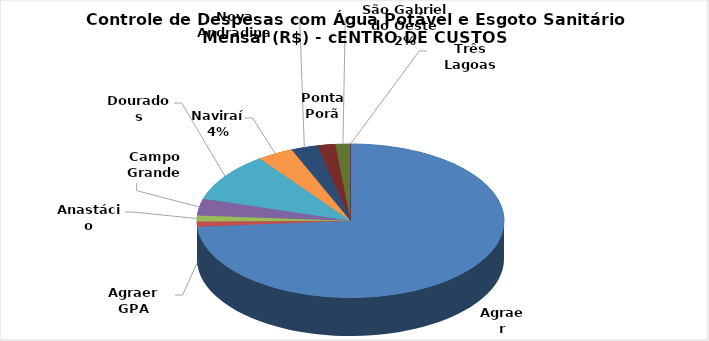
| Category | Series 0 |
|---|---|
| Agraer | 37862.97 |
| Agraer GPA | 540.45 |
| Anastácio | 653.76 |
| Campo Grande | 1817.61 |
| Dourados | 5307.21 |
| Naviraí | 1940.77 |
| Nova Andradina | 1430.83 |
| Ponta Porã | 973.35 |
| São Gabriel do Oeste | 805.93 |
| Três Lagoas | 0 |